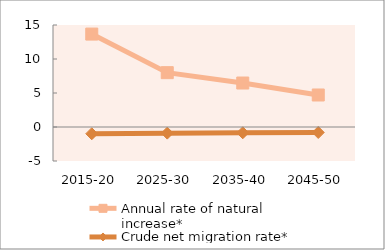
| Category | Annual rate of natural increase* | Crude net migration rate* |
|---|---|---|
| 2015-20 | 13.663 | -0.994 |
| 2025-30 | 7.991 | -0.901 |
| 2035-40 | 6.467 | -0.848 |
| 2045-50 | 4.708 | -0.807 |